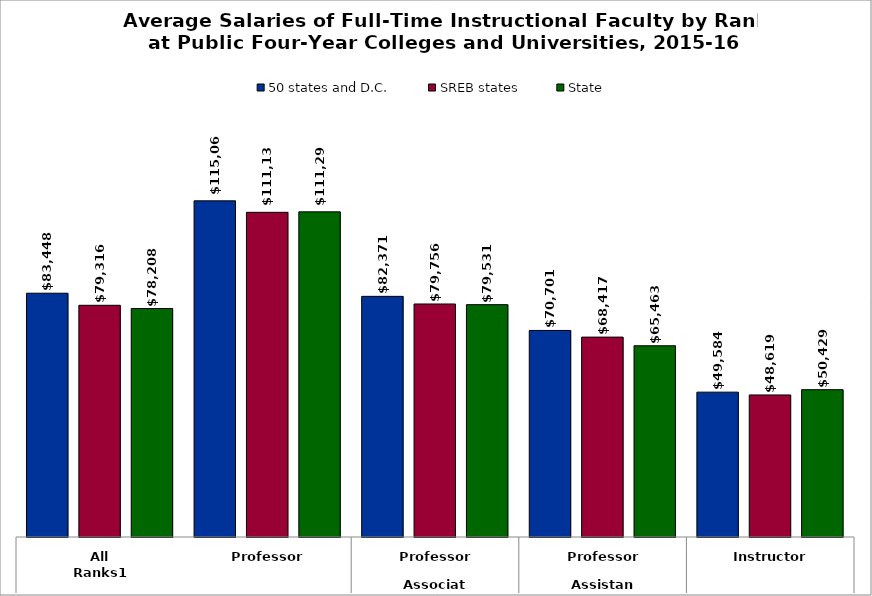
| Category | 50 states and D.C. | SREB states | State |
|---|---|---|---|
| 0 | 83448.294 | 79316.138 | 78207.84 |
| 1 | 115067.908 | 111138.898 | 111297.392 |
| 2 | 82370.986 | 79756.17 | 79530.717 |
| 3 | 70701.228 | 68416.92 | 65463.241 |
| 4 | 49583.906 | 48619.301 | 50429.022 |